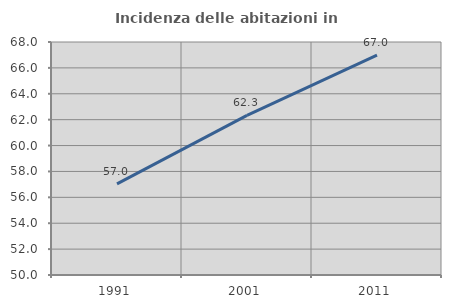
| Category | Incidenza delle abitazioni in proprietà  |
|---|---|
| 1991.0 | 57.037 |
| 2001.0 | 62.335 |
| 2011.0 | 66.982 |